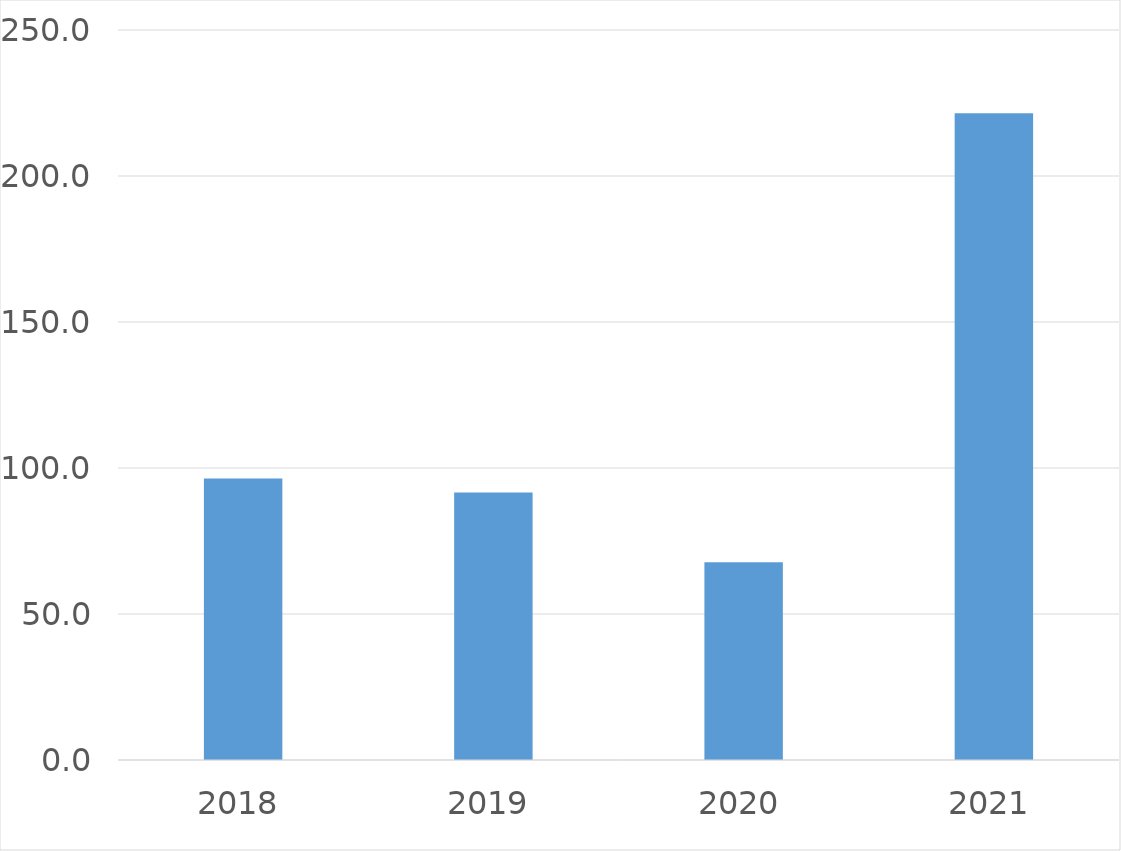
| Category | Series 0 |
|---|---|
| 2018 | 96.4 |
| 2019 | 91.6 |
| 2020 | 67.7 |
| 2021 | 221.5 |